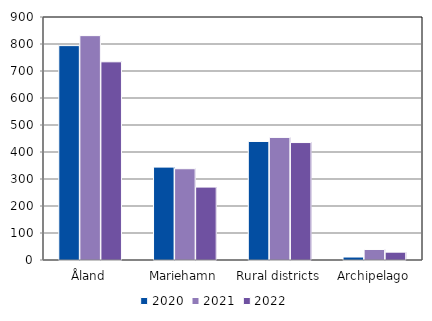
| Category | 2020 | 2021 | 2022 |
|---|---|---|---|
| Åland | 794 | 831 | 734 |
| Mariehamn | 344 | 338 | 270 |
| Rural districts | 439 | 454 | 435 |
| Archipelago | 11 | 39 | 29 |